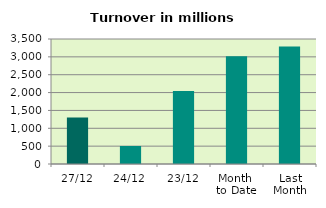
| Category | Series 0 |
|---|---|
| 27/12 | 1304.289 |
| 24/12 | 504.448 |
| 23/12 | 2046.847 |
| Month 
to Date | 3017.955 |
| Last
Month | 3292.145 |